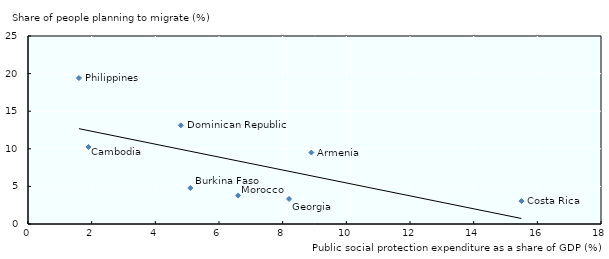
| Category | share of pt_mig |
|---|---|
| 8.9 | 9.5 |
| 5.1 | 4.79 |
| 1.9 | 10.24 |
| 15.5 | 3.05 |
| 4.8 | 13.12 |
| 8.2 | 3.33 |
| 6.6 | 3.79 |
| 1.6 | 19.41 |